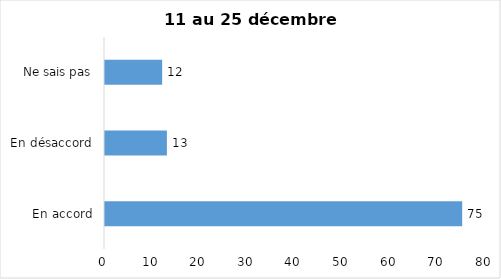
| Category | Series 0 |
|---|---|
| En accord | 75 |
| En désaccord | 13 |
| Ne sais pas | 12 |